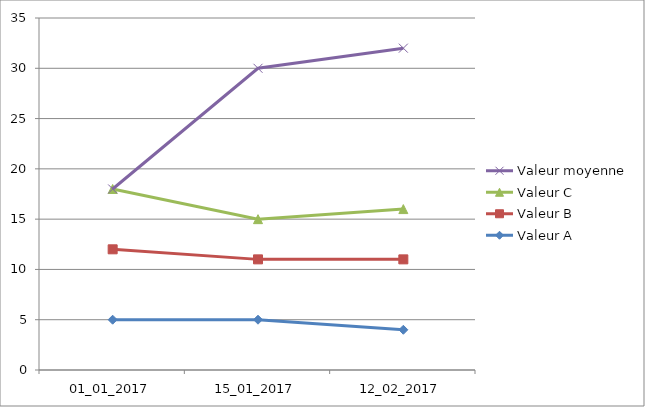
| Category | Valeur A | Valeur B | Valeur C | Valeur moyenne |
|---|---|---|---|---|
| 01_01_2017 | 5 | 7 | 6 | 0 |
| 15_01_2017 | 5 | 6 | 4 | 15 |
| 12_02_2017 | 4 | 7 | 5 | 16 |